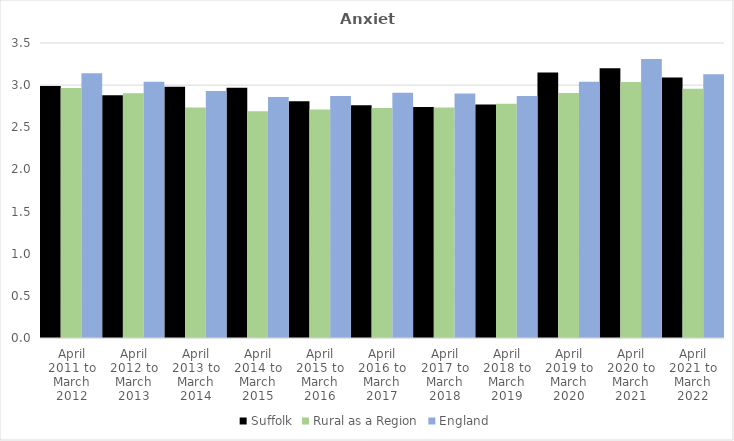
| Category | Suffolk | Rural as a Region | England |
|---|---|---|---|
| April 2011 to March 2012 | 2.99 | 2.967 | 3.14 |
| April 2012 to March 2013 | 2.88 | 2.904 | 3.04 |
| April 2013 to March 2014 | 2.98 | 2.734 | 2.93 |
| April 2014 to March 2015 | 2.97 | 2.691 | 2.86 |
| April 2015 to March 2016 | 2.81 | 2.711 | 2.87 |
| April 2016 to March 2017 | 2.76 | 2.729 | 2.91 |
| April 2017 to March 2018 | 2.74 | 2.736 | 2.9 |
| April 2018 to March 2019 | 2.77 | 2.78 | 2.87 |
| April 2019 to March 2020 | 3.15 | 2.908 | 3.04 |
| April 2020 to March 2021 | 3.2 | 3.036 | 3.31 |
| April 2021 to March 2022 | 3.09 | 2.956 | 3.13 |